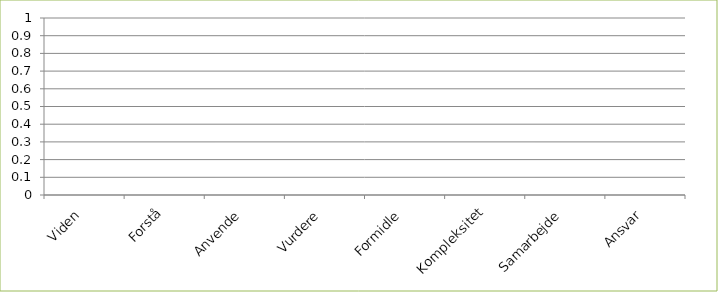
| Category | Series 0 |
|---|---|
| Viden | 0 |
| Forstå | 0 |
| Anvende | 0 |
| Vurdere | 0 |
| Formidle | 0 |
| Kompleksitet | 0 |
| Samarbejde | 0 |
| Ansvar | 0 |